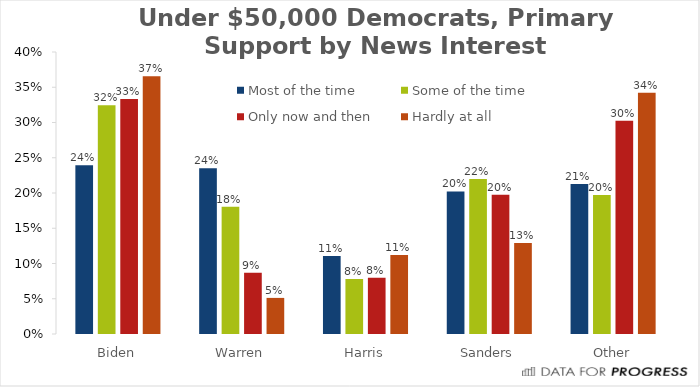
| Category | Most of the time | Some of the time | Only now and then | Hardly at all |
|---|---|---|---|---|
| Biden | 0.239 | 0.324 | 0.334 | 0.366 |
| Warren | 0.235 | 0.18 | 0.087 | 0.051 |
| Harris | 0.111 | 0.078 | 0.08 | 0.112 |
| Sanders | 0.202 | 0.22 | 0.197 | 0.129 |
| Other | 0.213 | 0.197 | 0.302 | 0.342 |